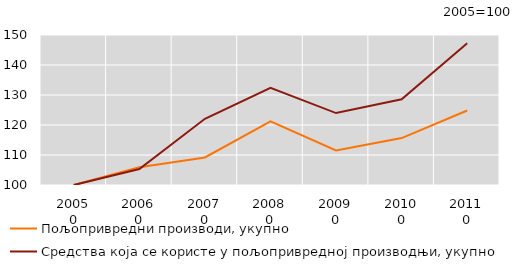
| Category | Пољопривредни производи, укупно | Средства која се користе у пољопривредној производњи, укупно |
|---|---|---|
| 0 | 100 | 99.993 |
| 1 | 105.937 | 105.333 |
| 2 | 109.187 | 122.062 |
| 3 | 121.186 | 132.404 |
| 4 | 111.514 | 123.977 |
| 5 | 115.634 | 128.564 |
| 6 | 124.836 | 147.222 |